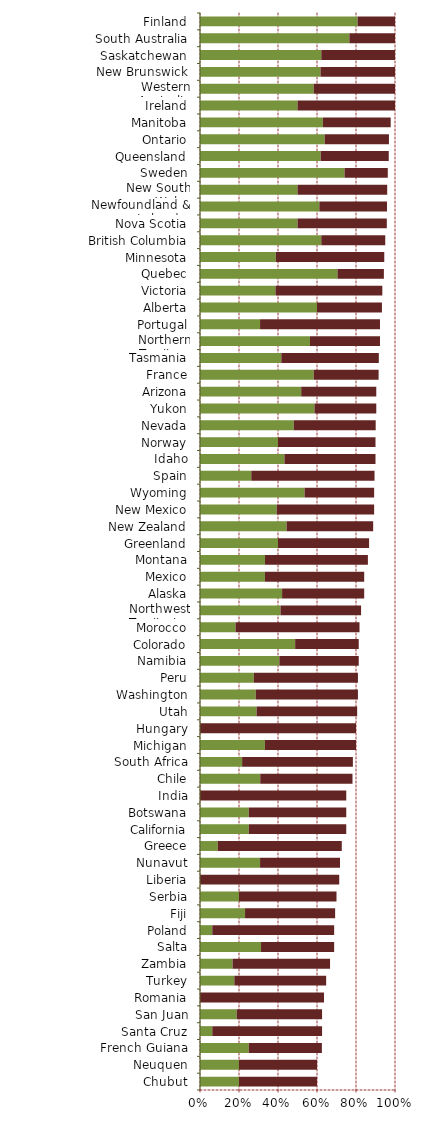
| Category |   Encourages Investment |   Not a Deterrent to Investment |
|---|---|---|
| Chubut | 0.2 | 0.4 |
| Neuquen | 0.2 | 0.4 |
| French Guiana | 0.25 | 0.375 |
| Santa Cruz | 0.063 | 0.563 |
| San Juan | 0.188 | 0.438 |
| Romania | 0 | 0.636 |
| Turkey | 0.176 | 0.471 |
| Zambia | 0.167 | 0.5 |
| Salta | 0.313 | 0.375 |
| Poland | 0.063 | 0.625 |
| Fiji | 0.231 | 0.462 |
| Serbia | 0.2 | 0.5 |
| Liberia | 0 | 0.714 |
| Nunavut | 0.308 | 0.41 |
| Greece | 0.091 | 0.636 |
| California | 0.25 | 0.5 |
| Botswana | 0.25 | 0.5 |
| India | 0 | 0.75 |
| Chile | 0.309 | 0.473 |
| South Africa | 0.216 | 0.568 |
| Michigan | 0.333 | 0.467 |
| Hungary | 0 | 0.8 |
| Utah | 0.29 | 0.516 |
| Washington | 0.286 | 0.524 |
| Peru | 0.276 | 0.534 |
| Namibia | 0.407 | 0.407 |
| Colorado | 0.488 | 0.326 |
| Morocco | 0.182 | 0.636 |
| Northwest Territories | 0.413 | 0.413 |
| Alaska | 0.421 | 0.421 |
| Mexico | 0.333 | 0.509 |
| Montana | 0.333 | 0.528 |
| Greenland | 0.4 | 0.467 |
| New Zealand | 0.444 | 0.444 |
| New Mexico | 0.393 | 0.5 |
| Wyoming | 0.536 | 0.357 |
| Spain | 0.263 | 0.632 |
| Idaho | 0.433 | 0.467 |
| Norway | 0.4 | 0.5 |
| Nevada | 0.481 | 0.42 |
| Yukon | 0.587 | 0.317 |
| Arizona | 0.519 | 0.385 |
| France | 0.583 | 0.333 |
| Tasmania | 0.417 | 0.5 |
| Northern Territory | 0.564 | 0.359 |
| Portugal | 0.308 | 0.615 |
| Alberta | 0.6 | 0.333 |
| Victoria | 0.387 | 0.548 |
| Quebec | 0.705 | 0.238 |
| Minnesota | 0.389 | 0.556 |
| British Columbia | 0.622 | 0.328 |
| Nova Scotia | 0.5 | 0.458 |
| Newfoundland & Labrador | 0.612 | 0.347 |
| New South Wales | 0.5 | 0.46 |
| Sweden | 0.741 | 0.222 |
| Queensland | 0.619 | 0.349 |
| Ontario | 0.639 | 0.33 |
| Manitoba | 0.63 | 0.348 |
| Ireland | 0.5 | 0.5 |
| Western Australia | 0.583 | 0.417 |
| New Brunswick | 0.618 | 0.382 |
| Saskatchewan | 0.622 | 0.378 |
| South Australia | 0.766 | 0.234 |
| Finland | 0.808 | 0.192 |